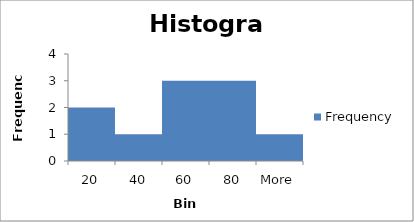
| Category | Frequency |
|---|---|
| 20 | 2 |
| 40 | 1 |
| 60 | 3 |
| 80 | 3 |
| More | 1 |